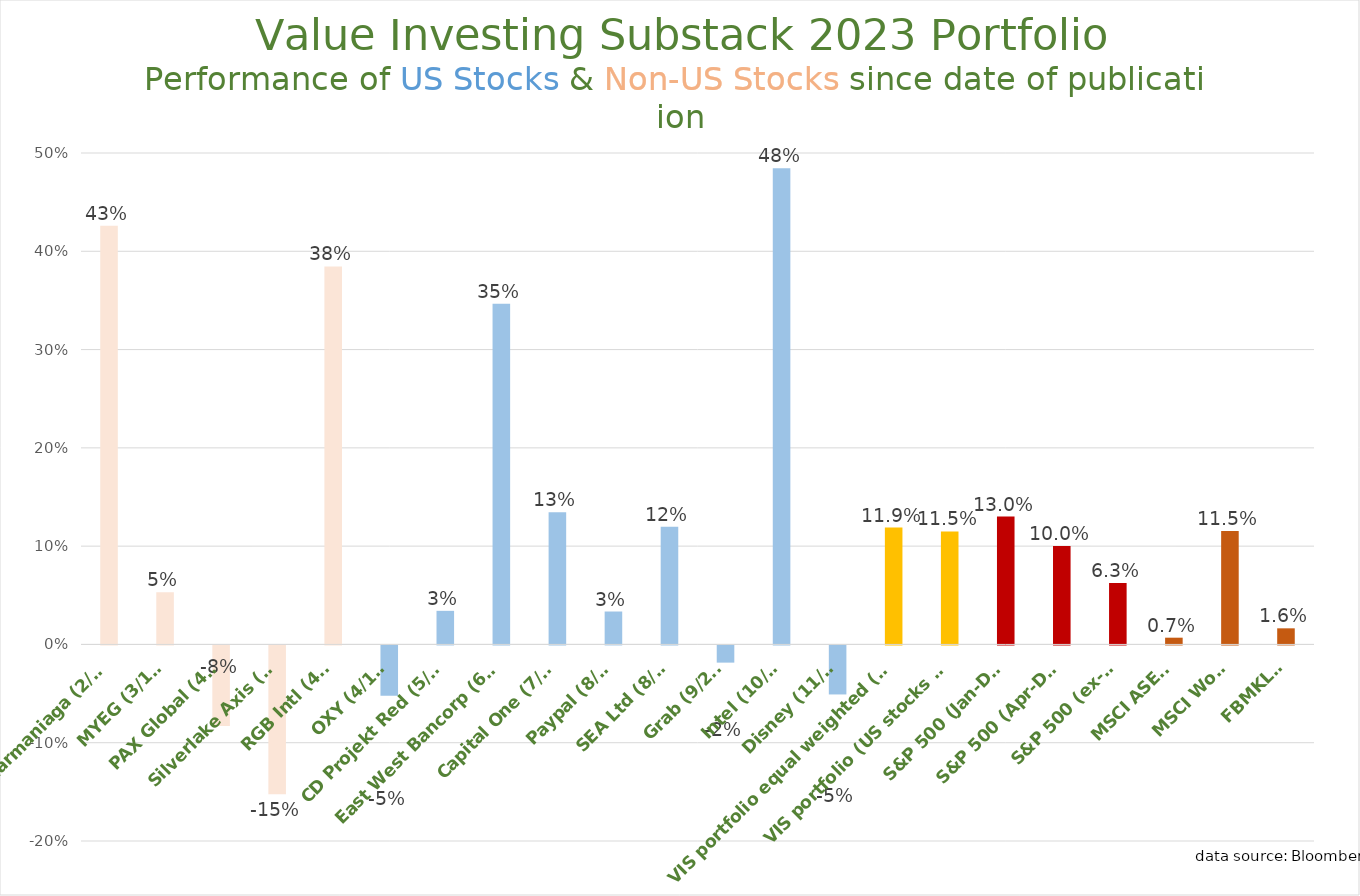
| Category | Series 0 |
|---|---|
| Pharmaniaga (2/28) | 0.426 |
| MYEG (3/13) | 0.053 |
| PAX Global (4/2) | -0.082 |
| Silverlake Axis (4/2) | -0.152 |
| RGB Intl (4/2) | 0.385 |
| OXY (4/17) | -0.051 |
| CD Projekt Red (5/16) | 0.034 |
| East West Bancorp (6/18) | 0.347 |
| Capital One (7/22) | 0.135 |
| Paypal (8/20) | 0.033 |
| SEA Ltd (8/27) | 0.12 |
| Grab (9/24) | -0.017 |
| Intel (10/23) | 0.484 |
| Disney (11/20) | -0.05 |
| VIS portfolio equal weighted (DCA) | 0.119 |
| VIS portfolio (US stocks only) | 0.115 |
| S&P 500 (Jan-Dec) | 0.13 |
| S&P 500 (Apr-Dec) | 0.1 |
| S&P 500 (ex-M7) | 0.063 |
| MSCI ASEAN | 0.007 |
| MSCI World | 0.115 |
| FBMKLCI | 0.016 |